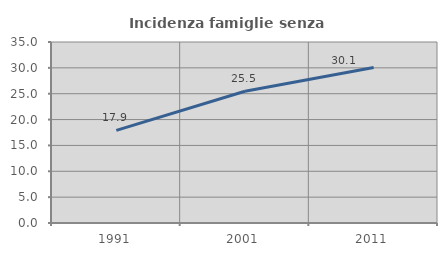
| Category | Incidenza famiglie senza nuclei |
|---|---|
| 1991.0 | 17.917 |
| 2001.0 | 25.484 |
| 2011.0 | 30.06 |